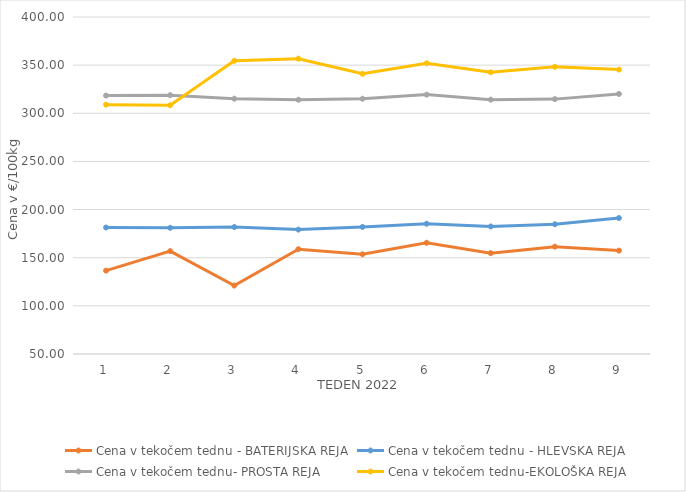
| Category | Cena v tekočem tednu - BATERIJSKA REJA | Cena v tekočem tednu - HLEVSKA REJA | Cena v tekočem tednu- PROSTA REJA | Cena v tekočem tednu-EKOLOŠKA REJA |
|---|---|---|---|---|
| 1.0 | 136.59 | 181.38 | 318.4 | 308.97 |
| 2.0 | 156.88 | 181.07 | 318.82 | 308.28 |
| 3.0 | 121.07 | 181.83 | 315.14 | 354.48 |
| 4.0 | 158.82 | 179.22 | 314.08 | 356.72 |
| 5.0 | 153.55 | 181.96 | 315.1 | 341.03 |
| 6.0 | 165.51 | 185.31 | 319.38 | 351.9 |
| 7.0 | 154.74 | 182.45 | 314.16 | 342.59 |
| 8.0 | 161.48 | 184.77 | 314.71 | 348.28 |
| 9.0 | 157.38 | 191.21 | 320.1 | 345.35 |